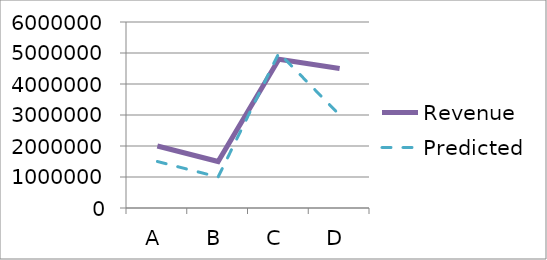
| Category | Revenue | Predicted |
|---|---|---|
| A | 2000000 | 1500000 |
| B | 1500000 | 1000000 |
| C | 4800000 | 5000000 |
| D | 4500000 | 3000000 |